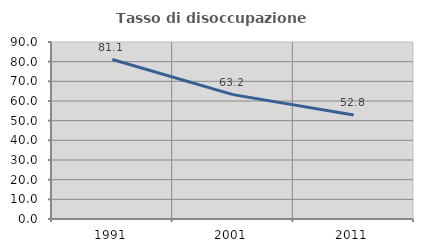
| Category | Tasso di disoccupazione giovanile  |
|---|---|
| 1991.0 | 81.095 |
| 2001.0 | 63.235 |
| 2011.0 | 52.83 |